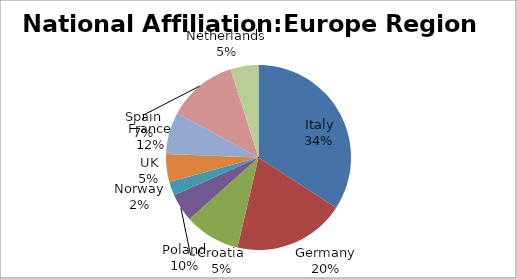
| Category | Series 0 |
|---|---|
| Italy | 14 |
| Germany | 8 |
| Poland | 4 |
| Croatia | 2 |
| Norway | 1 |
| UK | 2 |
| Spain | 3 |
| France | 5 |
| Netherlands | 2 |